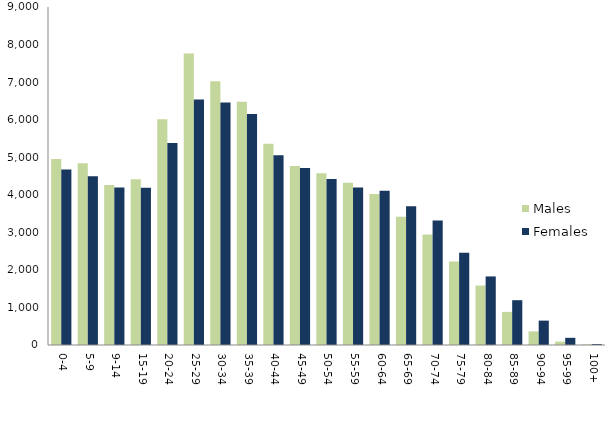
| Category | Males | Females |
|---|---|---|
| 0-4 | 4951 | 4671 |
| 5-9 | 4841 | 4493 |
| 9-14 | 4260 | 4195 |
| 15-19 | 4412 | 4188 |
| 20-24 | 6008 | 5378 |
| 25-29 | 7765 | 6538 |
| 30-34 | 7024 | 6455 |
| 35-39 | 6477 | 6150 |
| 40-44 | 5362 | 5054 |
| 45-49 | 4769 | 4711 |
| 50-54 | 4571 | 4421 |
| 55-59 | 4318 | 4196 |
| 60-64 | 4024 | 4108 |
| 65-69 | 3412 | 3696 |
| 70-74 | 2943 | 3316 |
| 75-79 | 2223 | 2459 |
| 80-84 | 1583 | 1826 |
| 85-89 | 881 | 1193 |
| 90-94 | 363 | 649 |
| 95-99 | 89 | 191 |
| 100+ | 16 | 25 |